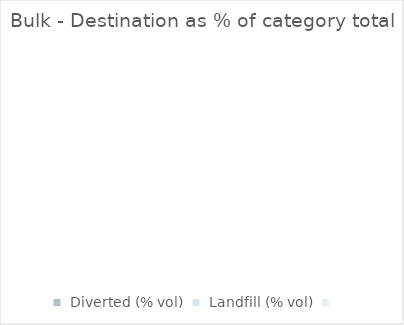
| Category |  Bulk  |
|---|---|
|  Diverted (% vol)  | 0 |
|  Landfill (% vol)  | 0 |